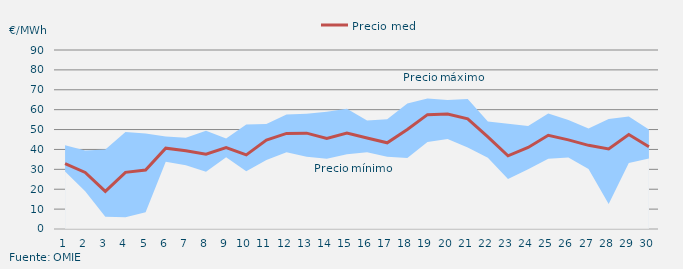
| Category | Precio medio |
|---|---|
| 1 | 32.835 |
| 2 | 28.439 |
| 3 | 18.878 |
| 4 | 28.479 |
| 5 | 29.624 |
| 6 | 40.644 |
| 7 | 39.298 |
| 8 | 37.595 |
| 9 | 40.915 |
| 10 | 37.266 |
| 11 | 44.738 |
| 12 | 48.059 |
| 13 | 48.191 |
| 14 | 45.525 |
| 15 | 48.208 |
| 16 | 45.749 |
| 17 | 43.335 |
| 18 | 50.013 |
| 19 | 57.489 |
| 20 | 57.846 |
| 21 | 55.424 |
| 22 | 46.312 |
| 23 | 36.777 |
| 24 | 41.017 |
| 25 | 47.123 |
| 26 | 44.811 |
| 27 | 42.071 |
| 28 | 40.215 |
| 29 | 47.53 |
| 30 | 41.361 |